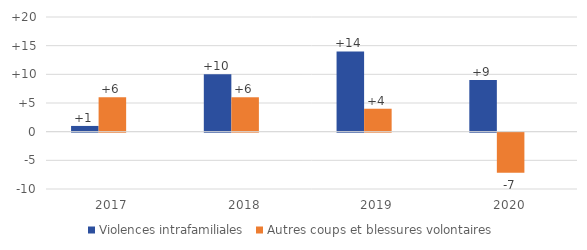
| Category | Violences intrafamiliales | Autres coups et blessures volontaires | Series 2 |
|---|---|---|---|
| 2017.0 | 1 | 6 |  |
| 2018.0 | 10 | 6 |  |
| 2019.0 | 14 | 4 |  |
| 2020.0 | 9 | -7 |  |